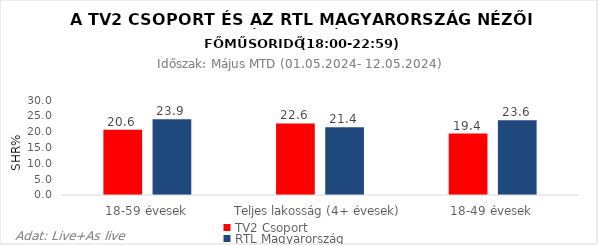
| Category | TV2 Csoport | RTL Magyarország |
|---|---|---|
| 18-59 évesek | 20.6 | 23.9 |
| Teljes lakosság (4+ évesek) | 22.6 | 21.4 |
| 18-49 évesek | 19.4 | 23.6 |